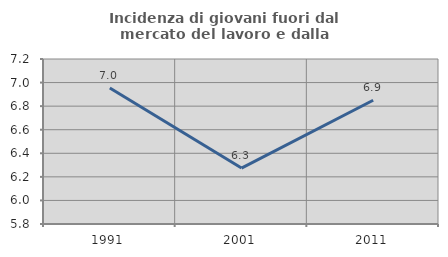
| Category | Incidenza di giovani fuori dal mercato del lavoro e dalla formazione  |
|---|---|
| 1991.0 | 6.954 |
| 2001.0 | 6.275 |
| 2011.0 | 6.85 |